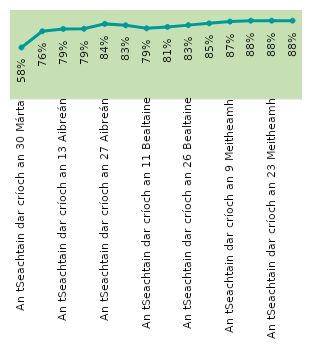
| Category | Series 0 |
|---|---|
| An tSeachtain dar críoch an 30 Márta | 0.579 |
| An tSeachtain dar críoch an 6 Aibreán | 0.761 |
| An tSeachtain dar críoch an 13 Aibreán | 0.787 |
| An tSeachtain dar críoch an 20 Aibreán | 0.789 |
| An tSeachtain dar críoch an 27 Aibreán | 0.844 |
| An tSeachtain dar críoch an 4 Bealtaine | 0.828 |
| An tSeachtain dar críoch an 11 Bealtaine | 0.794 |
| An tSeachtain dar críoch an 19 Bealtaine | 0.81 |
| An tSeachtain dar críoch an 26 Bealtaine | 0.83 |
| An tSeachtain dar críoch an 2 Meitheamh | 0.85 |
| An tSeachtain dar críoch an 9 Meitheamh | 0.87 |
| An tSeachtain dar críoch an 16 Meitheamh | 0.88 |
| An tSeachtain dar críoch an 23 Meitheamh | 0.88 |
| An tSeachtain dar críoch an 30 Meitheamh | 0.88 |